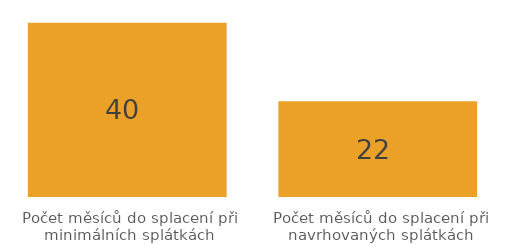
| Category | Series 0 |
|---|---|
| Počet měsíců do splacení při minimálních splátkách | 40 |
| Počet měsíců do splacení při navrhovaných splátkách | 22 |